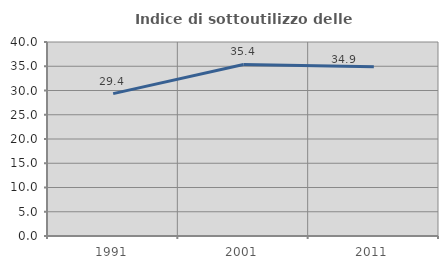
| Category | Indice di sottoutilizzo delle abitazioni  |
|---|---|
| 1991.0 | 29.362 |
| 2001.0 | 35.366 |
| 2011.0 | 34.902 |